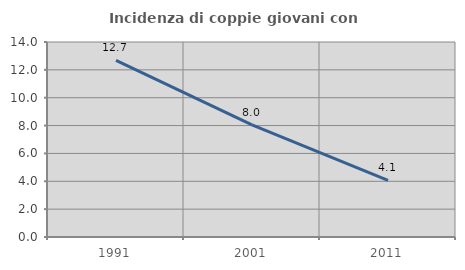
| Category | Incidenza di coppie giovani con figli |
|---|---|
| 1991.0 | 12.683 |
| 2001.0 | 8.046 |
| 2011.0 | 4.064 |